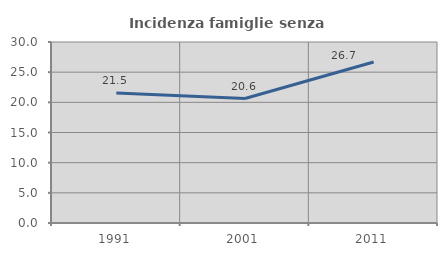
| Category | Incidenza famiglie senza nuclei |
|---|---|
| 1991.0 | 21.536 |
| 2001.0 | 20.625 |
| 2011.0 | 26.683 |